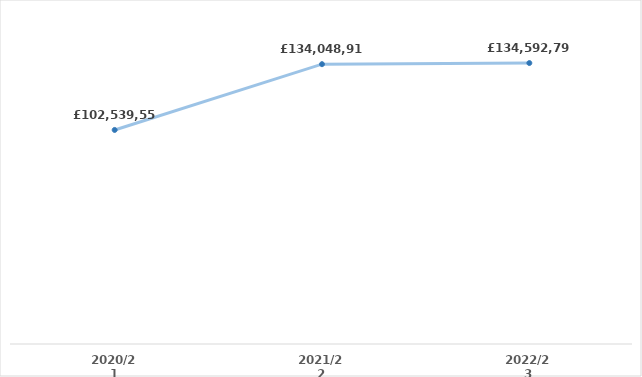
| Category | Total amount owed |
|---|---|
| 2020/21 | 102539557.528 |
| 2021/22 | 134048916.658 |
| 2022/23 | 134592789.839 |